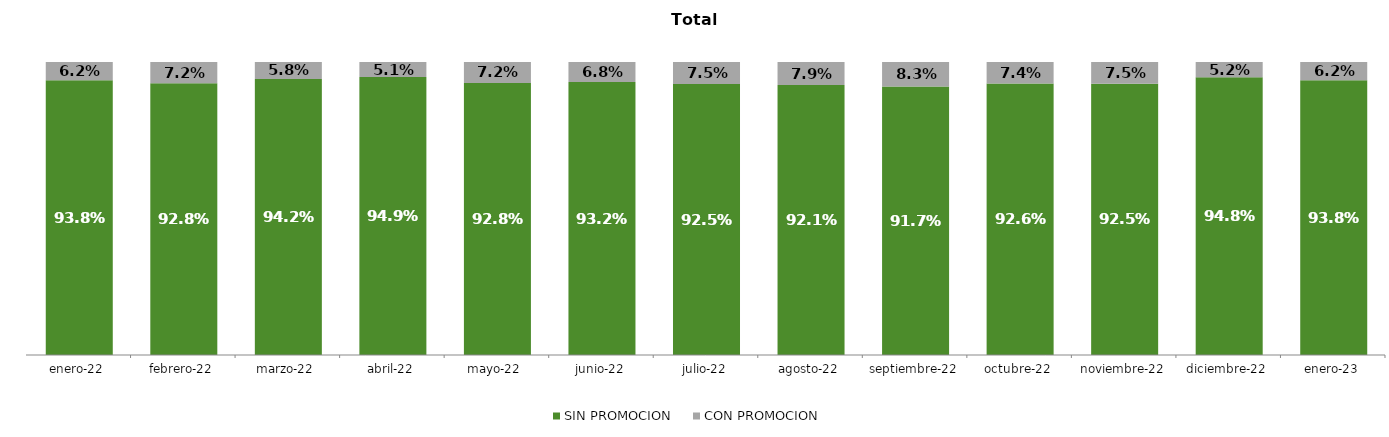
| Category | SIN PROMOCION   | CON PROMOCION   |
|---|---|---|
| 2022-01-01 | 0.938 | 0.062 |
| 2022-02-01 | 0.928 | 0.072 |
| 2022-03-01 | 0.942 | 0.058 |
| 2022-04-01 | 0.949 | 0.051 |
| 2022-05-01 | 0.928 | 0.072 |
| 2022-06-01 | 0.932 | 0.068 |
| 2022-07-01 | 0.925 | 0.075 |
| 2022-08-01 | 0.921 | 0.079 |
| 2022-09-01 | 0.917 | 0.083 |
| 2022-10-01 | 0.926 | 0.074 |
| 2022-11-01 | 0.925 | 0.075 |
| 2022-12-01 | 0.948 | 0.052 |
| 2023-01-01 | 0.938 | 0.062 |